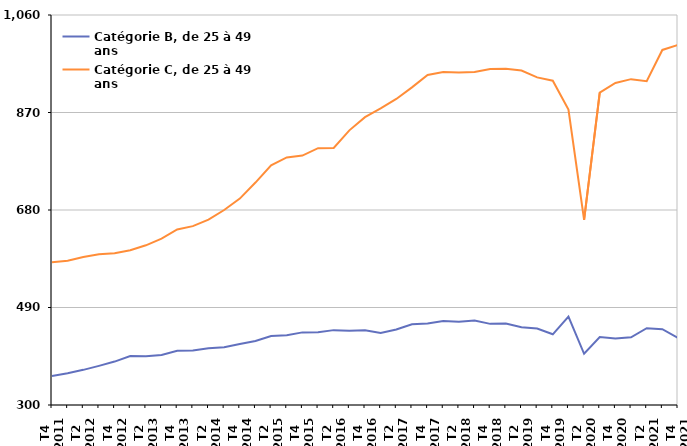
| Category | Catégorie B, de 25 à 49 ans | Catégorie C, de 25 à 49 ans |
|---|---|---|
| T4
2011 | 356.7 | 578.3 |
| T1
2012 | 361.7 | 581.2 |
| T2
2012 | 368.5 | 588.4 |
| T3
2012 | 376.3 | 593.9 |
| T4
2012 | 384.6 | 595.8 |
| T1
2013 | 395.5 | 601.6 |
| T2
2013 | 395 | 611.2 |
| T3
2013 | 397.5 | 624.1 |
| T4
2013 | 405.5 | 642.2 |
| T1
2014 | 406.2 | 648.5 |
| T2
2014 | 410.7 | 661.3 |
| T3
2014 | 412.5 | 680 |
| T4
2014 | 418.8 | 702.2 |
| T1
2015 | 424.7 | 733.5 |
| T2
2015 | 434.3 | 767.2 |
| T3
2015 | 436.1 | 782.5 |
| T4
2015 | 441.5 | 786 |
| T1
2016 | 441.6 | 800.5 |
| T2
2016 | 445.9 | 801 |
| T3
2016 | 444.9 | 835.2 |
| T4
2016 | 445.8 | 861 |
| T1
2017 | 440.3 | 878.1 |
| T2
2017 | 447.1 | 896.4 |
| T3
2017 | 457.2 | 919 |
| T4
2017 | 458.7 | 943.1 |
| T1
2018 | 463.7 | 948.7 |
| T2
2018 | 462.1 | 947.8 |
| T3
2018 | 464.6 | 948.8 |
| T4
2018 | 458.1 | 954.9 |
| T1
2019 | 458.6 | 955.1 |
| T2
2019 | 451.5 | 951.7 |
| T3
2019 | 449 | 938.4 |
| T4
2019 | 437.8 | 931.9 |
| T1
2020 | 472.4 | 875.8 |
| T2
2020 | 399.8 | 660.8 |
| T3
2020 | 432.5 | 908.6 |
| T4
2020 | 429.6 | 927.5 |
| T1
2021 | 431.9 | 935 |
| T2
2021 | 449.6 | 931 |
| T3
2021 | 447.7 | 991.9 |
| T4
2021 | 430.7 | 1001.8 |